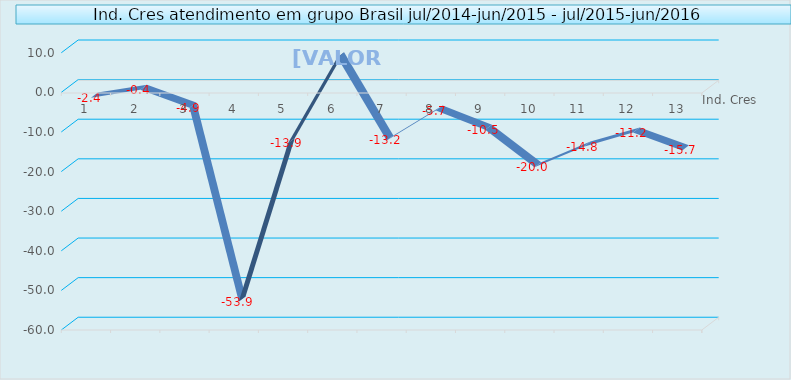
| Category | Ind. Cres |
|---|---|
| 0 | -2.414 |
| 1 | -0.437 |
| 2 | -4.927 |
| 3 | -53.897 |
| 4 | -13.857 |
| 5 | 7.744 |
| 6 | -13.224 |
| 7 | -5.679 |
| 8 | -10.513 |
| 9 | -20.004 |
| 10 | -14.782 |
| 11 | -11.232 |
| 12 | -15.726 |